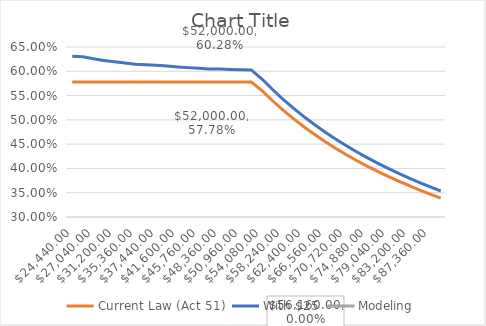
| Category | Current Law (Act 51) | With $25 | Modeling |
|---|---|---|---|
| 24440.0 | 0.578 | 0.631 | 0 |
| 24960.0 | 0.578 | 0.63 | 0 |
| 27040.0 | 0.578 | 0.626 | 0 |
| 29120.0 | 0.578 | 0.622 | 0 |
| 31200.0 | 0.578 | 0.619 | 0 |
| 33280.0 | 0.578 | 0.617 | 0 |
| 35360.0 | 0.578 | 0.615 | 0 |
| 36400.0 | 0.578 | 0.613 | 0 |
| 37440.0 | 0.578 | 0.612 | 0 |
| 39520.0 | 0.578 | 0.611 | 0 |
| 41600.0 | 0.578 | 0.609 | 0 |
| 43680.0 | 0.578 | 0.608 | 0 |
| 45760.0 | 0.578 | 0.606 | 0 |
| 47840.0 | 0.578 | 0.605 | 0 |
| 48360.0 | 0.578 | 0.605 | 0 |
| 49920.0 | 0.578 | 0.604 | 0 |
| 50960.0 | 0.578 | 0.603 | 0 |
| 52000.0 | 0.578 | 0.603 | 0 |
| 54080.0 | 0.561 | 0.585 | 0 |
| 56160.0 | 0.54 | 0.563 | 0 |
| 58240.0 | 0.521 | 0.543 | 0 |
| 60320.0 | 0.503 | 0.524 | 0 |
| 62400.0 | 0.486 | 0.507 | 0 |
| 64480.0 | 0.47 | 0.49 | 0 |
| 66560.0 | 0.455 | 0.475 | 0 |
| 68640.0 | 0.442 | 0.461 | 0 |
| 70720.0 | 0.429 | 0.447 | 0 |
| 72800.0 | 0.416 | 0.434 | 0 |
| 74880.0 | 0.405 | 0.422 | 0 |
| 76960.0 | 0.394 | 0.411 | 0 |
| 79040.0 | 0.384 | 0.4 | 0 |
| 81120.0 | 0.374 | 0.39 | 0 |
| 83200.0 | 0.364 | 0.38 | 0 |
| 85280.0 | 0.355 | 0.371 | 0 |
| 87360.0 | 0.347 | 0.362 | 0 |
| 89440.0 | 0.339 | 0.353 | 0 |